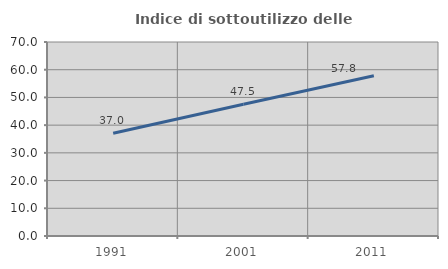
| Category | Indice di sottoutilizzo delle abitazioni  |
|---|---|
| 1991.0 | 37.047 |
| 2001.0 | 47.545 |
| 2011.0 | 57.812 |